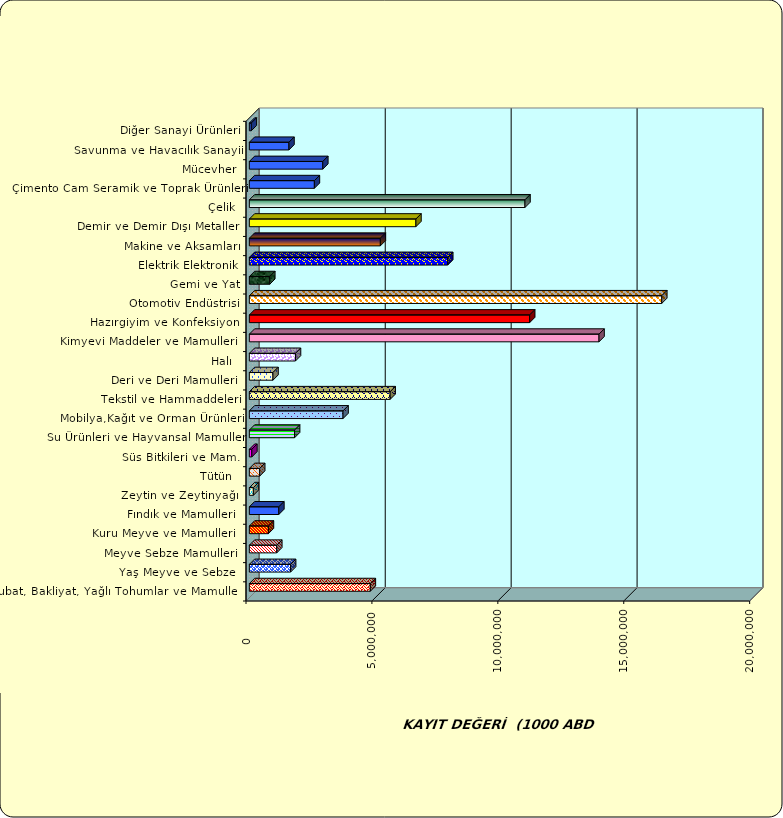
| Category | Series 0 |
|---|---|
|  Hububat, Bakliyat, Yağlı Tohumlar ve Mamulleri  | 4803523.02 |
|  Yaş Meyve ve Sebze   | 1638130.219 |
|  Meyve Sebze Mamulleri  | 1088589.102 |
|  Kuru Meyve ve Mamulleri   | 756673.725 |
|  Fındık ve Mamulleri  | 1170439.032 |
|  Zeytin ve Zeytinyağı  | 159622.81 |
|  Tütün  | 410061.018 |
|  Süs Bitkileri ve Mam. | 98710.286 |
|  Su Ürünleri ve Hayvansal Mamuller | 1795939.004 |
|  Mobilya,Kağıt ve Orman Ürünleri | 3720082.025 |
|  Tekstil ve Hammaddeleri | 5590693.917 |
|  Deri ve Deri Mamulleri  | 938349.463 |
|  Halı  | 1831515.835 |
|  Kimyevi Maddeler ve Mamulleri   | 13885154.127 |
|  Hazırgiyim ve Konfeksiyon  | 11130782.08 |
|  Otomotiv Endüstrisi | 16376695.406 |
|  Gemi ve Yat | 811047.708 |
|  Elektrik Elektronik | 7877045.175 |
|  Makine ve Aksamları | 5202093.961 |
|  Demir ve Demir Dışı Metaller  | 6614212.557 |
|  Çelik | 10944693.552 |
|  Çimento Cam Seramik ve Toprak Ürünleri | 2582363.488 |
|  Mücevher | 2916543.954 |
|  Savunma ve Havacılık Sanayii | 1572872.905 |
|  Diğer Sanayi Ürünleri | 77115.905 |